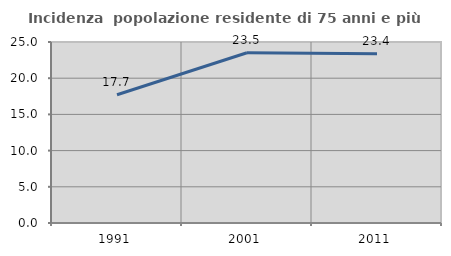
| Category | Incidenza  popolazione residente di 75 anni e più |
|---|---|
| 1991.0 | 17.718 |
| 2001.0 | 23.513 |
| 2011.0 | 23.38 |